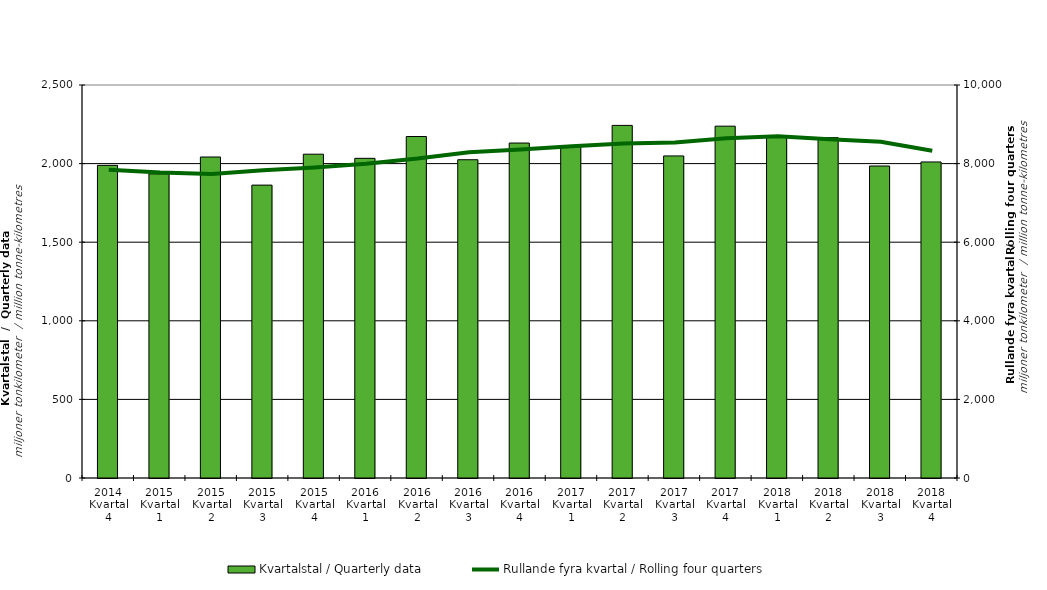
| Category | Kvartalstal / Quarterly data |
|---|---|
| 2014 Kvartal 4 | 1988.83 |
| 2015 Kvartal 1 | 1934.598 |
| 2015 Kvartal 2 | 2041.891 |
| 2015 Kvartal 3 | 1863.08 |
| 2015 Kvartal 4 | 2059.851 |
| 2016 Kvartal 1 | 2033.587 |
| 2016 Kvartal 2 | 2172.381 |
| 2016 Kvartal 3 | 2024.615 |
| 2016 Kvartal 4 | 2130.769 |
| 2017 Kvartal 1 | 2113.385 |
| 2017 Kvartal 2 | 2243.036 |
| 2017 Kvartal 3 | 2048.826 |
| 2017 Kvartal 4 | 2238.139 |
| 2018 Kvartal 1 | 2168.998 |
| 2018 Kvartal 2 | 2165.135 |
| 2018 Kvartal 3 | 1984.645 |
| 2018 Kvartal 4 | 2010.436 |